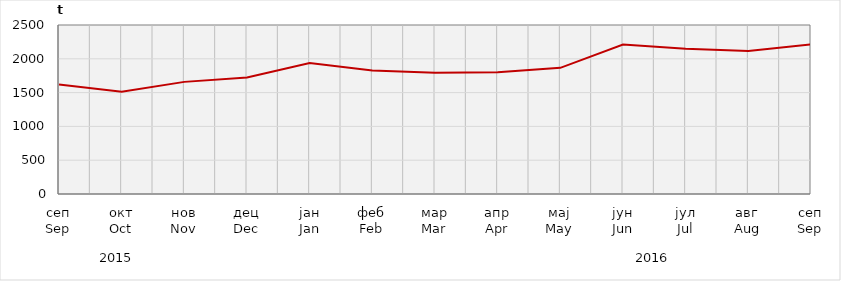
| Category | Нето тежина заклане стоке                              Net weight of  slaughtered livestock |
|---|---|
| сеп
Sep | 1619599 |
| окт
Oct | 1511667.7 |
| нов
Nov | 1658700 |
| дец
Dec | 1721996.5 |
| јан
Jan | 1938649.7 |
| феб
Feb | 1828587.85 |
| мар
Mar | 1792740.7 |
| апр
Apr | 1800600 |
| мај
May | 1866665 |
| јун
Jun | 2210576.92 |
| јул
Jul | 2148617 |
| авг
Aug | 2114109.78 |
| сеп
Sep | 2211725.58 |